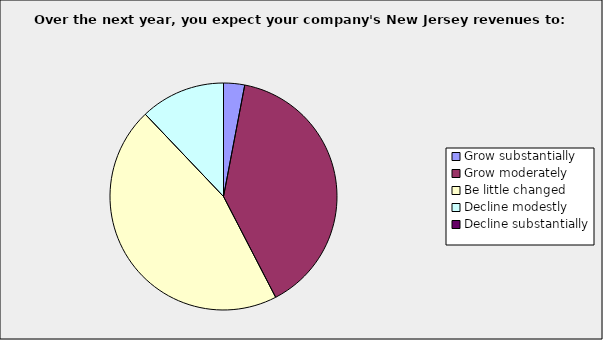
| Category | Series 0 |
|---|---|
| Grow substantially | 0.03 |
| Grow moderately | 0.394 |
| Be little changed | 0.455 |
| Decline modestly | 0.121 |
| Decline substantially | 0 |